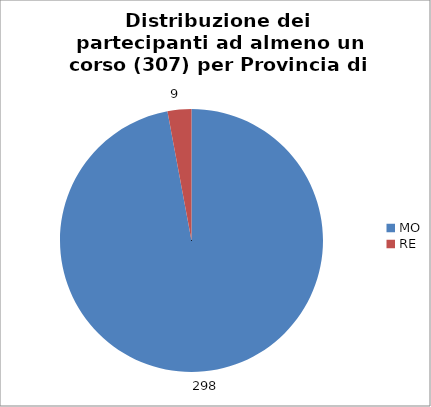
| Category | Nr. Tesserati |
|---|---|
| MO | 298 |
| RE | 9 |